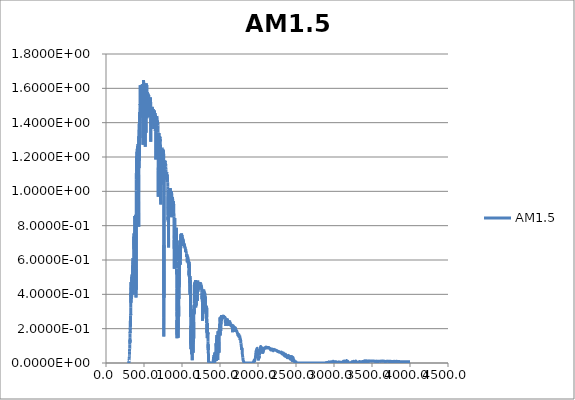
| Category | AM1.5 |
|---|---|
| 280.0 | 0 |
| 280.5 | 0 |
| 281.0 | 0 |
| 281.5 | 0 |
| 282.0 | 0 |
| 282.5 | 0 |
| 283.0 | 0 |
| 283.5 | 0 |
| 284.0 | 0 |
| 284.5 | 0 |
| 285.0 | 0 |
| 285.5 | 0 |
| 286.0 | 0 |
| 286.5 | 0 |
| 287.0 | 0 |
| 287.5 | 0 |
| 288.0 | 0 |
| 288.5 | 0 |
| 289.0 | 0 |
| 289.5 | 0 |
| 290.0 | 0 |
| 290.5 | 0 |
| 291.0 | 0 |
| 291.5 | 0 |
| 292.0 | 0 |
| 292.5 | 0 |
| 293.0 | 0 |
| 293.5 | 0 |
| 294.0 | 0 |
| 294.5 | 0 |
| 295.0 | 0 |
| 295.5 | 0 |
| 296.0 | 0 |
| 296.5 | 0 |
| 297.0 | 0 |
| 297.5 | 0 |
| 298.0 | 0 |
| 298.5 | 0 |
| 299.0 | 0 |
| 299.5 | 0.001 |
| 300.0 | 0.001 |
| 300.5 | 0.001 |
| 301.0 | 0.002 |
| 301.5 | 0.003 |
| 302.0 | 0.003 |
| 302.5 | 0.004 |
| 303.0 | 0.007 |
| 303.5 | 0.009 |
| 304.0 | 0.009 |
| 304.5 | 0.012 |
| 305.0 | 0.016 |
| 305.5 | 0.019 |
| 306.0 | 0.019 |
| 306.5 | 0.021 |
| 307.0 | 0.028 |
| 307.5 | 0.036 |
| 308.0 | 0.038 |
| 308.5 | 0.041 |
| 309.0 | 0.041 |
| 309.5 | 0.043 |
| 310.0 | 0.051 |
| 310.5 | 0.066 |
| 311.0 | 0.083 |
| 311.5 | 0.084 |
| 312.0 | 0.093 |
| 312.5 | 0.099 |
| 313.0 | 0.107 |
| 313.5 | 0.108 |
| 314.0 | 0.12 |
| 314.5 | 0.131 |
| 315.0 | 0.136 |
| 315.5 | 0.118 |
| 316.0 | 0.123 |
| 316.5 | 0.15 |
| 317.0 | 0.172 |
| 317.5 | 0.182 |
| 318.0 | 0.176 |
| 318.5 | 0.186 |
| 319.0 | 0.205 |
| 319.5 | 0.196 |
| 320.0 | 0.205 |
| 320.5 | 0.245 |
| 321.0 | 0.25 |
| 321.5 | 0.238 |
| 322.0 | 0.222 |
| 322.5 | 0.217 |
| 323.0 | 0.212 |
| 323.5 | 0.249 |
| 324.0 | 0.275 |
| 324.5 | 0.283 |
| 325.0 | 0.279 |
| 325.5 | 0.324 |
| 326.0 | 0.381 |
| 326.5 | 0.407 |
| 327.0 | 0.398 |
| 327.5 | 0.385 |
| 328.0 | 0.351 |
| 328.5 | 0.372 |
| 329.0 | 0.422 |
| 329.5 | 0.469 |
| 330.0 | 0.471 |
| 330.5 | 0.428 |
| 331.0 | 0.403 |
| 331.5 | 0.418 |
| 332.0 | 0.436 |
| 332.5 | 0.439 |
| 333.0 | 0.429 |
| 333.5 | 0.407 |
| 334.0 | 0.415 |
| 334.5 | 0.445 |
| 335.0 | 0.464 |
| 335.5 | 0.453 |
| 336.0 | 0.415 |
| 336.5 | 0.382 |
| 337.0 | 0.374 |
| 337.5 | 0.401 |
| 338.0 | 0.434 |
| 338.5 | 0.455 |
| 339.0 | 0.464 |
| 339.5 | 0.474 |
| 340.0 | 0.502 |
| 340.5 | 0.501 |
| 341.0 | 0.471 |
| 341.5 | 0.469 |
| 342.0 | 0.489 |
| 342.5 | 0.508 |
| 343.0 | 0.515 |
| 343.5 | 0.486 |
| 344.0 | 0.418 |
| 344.5 | 0.403 |
| 345.0 | 0.459 |
| 345.5 | 0.489 |
| 346.0 | 0.478 |
| 346.5 | 0.487 |
| 347.0 | 0.494 |
| 347.5 | 0.477 |
| 348.0 | 0.475 |
| 348.5 | 0.483 |
| 349.0 | 0.466 |
| 349.5 | 0.478 |
| 350.0 | 0.528 |
| 350.5 | 0.567 |
| 351.0 | 0.552 |
| 351.5 | 0.53 |
| 352.0 | 0.518 |
| 352.5 | 0.49 |
| 353.0 | 0.52 |
| 353.5 | 0.572 |
| 354.0 | 0.605 |
| 354.5 | 0.612 |
| 355.0 | 0.611 |
| 355.5 | 0.59 |
| 356.0 | 0.554 |
| 356.5 | 0.519 |
| 357.0 | 0.457 |
| 357.5 | 0.462 |
| 358.0 | 0.43 |
| 358.5 | 0.399 |
| 359.0 | 0.47 |
| 359.5 | 0.565 |
| 360.0 | 0.598 |
| 360.5 | 0.565 |
| 361.0 | 0.52 |
| 361.5 | 0.51 |
| 362.0 | 0.534 |
| 362.5 | 0.585 |
| 363.0 | 0.602 |
| 363.5 | 0.585 |
| 364.0 | 0.606 |
| 364.5 | 0.601 |
| 365.0 | 0.624 |
| 365.5 | 0.686 |
| 366.0 | 0.735 |
| 366.5 | 0.737 |
| 367.0 | 0.723 |
| 367.5 | 0.709 |
| 368.0 | 0.668 |
| 368.5 | 0.663 |
| 369.0 | 0.693 |
| 369.5 | 0.745 |
| 370.0 | 0.755 |
| 370.5 | 0.683 |
| 371.0 | 0.693 |
| 371.5 | 0.721 |
| 372.0 | 0.674 |
| 372.5 | 0.643 |
| 373.0 | 0.619 |
| 373.5 | 0.558 |
| 374.0 | 0.556 |
| 374.5 | 0.552 |
| 375.0 | 0.589 |
| 375.5 | 0.652 |
| 376.0 | 0.675 |
| 376.5 | 0.664 |
| 377.0 | 0.712 |
| 377.5 | 0.795 |
| 378.0 | 0.856 |
| 378.5 | 0.834 |
| 379.0 | 0.744 |
| 379.5 | 0.667 |
| 380.0 | 0.701 |
| 380.5 | 0.751 |
| 381.0 | 0.764 |
| 381.5 | 0.688 |
| 382.0 | 0.587 |
| 382.5 | 0.508 |
| 383.0 | 0.455 |
| 383.5 | 0.44 |
| 384.0 | 0.51 |
| 384.5 | 0.614 |
| 385.0 | 0.674 |
| 385.5 | 0.644 |
| 386.0 | 0.621 |
| 386.5 | 0.646 |
| 387.0 | 0.651 |
| 387.5 | 0.642 |
| 388.0 | 0.636 |
| 388.5 | 0.631 |
| 389.0 | 0.685 |
| 389.5 | 0.76 |
| 390.0 | 0.797 |
| 390.5 | 0.804 |
| 391.0 | 0.851 |
| 391.5 | 0.863 |
| 392.0 | 0.795 |
| 392.5 | 0.663 |
| 393.0 | 0.48 |
| 393.5 | 0.382 |
| 394.0 | 0.496 |
| 394.5 | 0.684 |
| 395.0 | 0.808 |
| 395.5 | 0.86 |
| 396.0 | 0.757 |
| 396.5 | 0.55 |
| 397.0 | 0.426 |
| 397.5 | 0.629 |
| 398.0 | 0.852 |
| 398.5 | 1.007 |
| 399.0 | 1.069 |
| 399.5 | 1.102 |
| 400.0 | 1.114 |
| 401.0 | 1.16 |
| 402.0 | 1.206 |
| 403.0 | 1.161 |
| 404.0 | 1.18 |
| 405.0 | 1.151 |
| 406.0 | 1.123 |
| 407.0 | 1.103 |
| 408.0 | 1.151 |
| 409.0 | 1.23 |
| 410.0 | 1.048 |
| 411.0 | 1.174 |
| 412.0 | 1.248 |
| 413.0 | 1.197 |
| 414.0 | 1.184 |
| 415.0 | 1.226 |
| 416.0 | 1.262 |
| 417.0 | 1.231 |
| 418.0 | 1.178 |
| 419.0 | 1.226 |
| 420.0 | 1.123 |
| 421.0 | 1.276 |
| 422.0 | 1.258 |
| 423.0 | 1.218 |
| 424.0 | 1.212 |
| 425.0 | 1.249 |
| 426.0 | 1.214 |
| 427.0 | 1.172 |
| 428.0 | 1.184 |
| 429.0 | 1.096 |
| 430.0 | 0.875 |
| 431.0 | 0.794 |
| 432.0 | 1.321 |
| 433.0 | 1.229 |
| 434.0 | 1.135 |
| 435.0 | 1.245 |
| 436.0 | 1.366 |
| 437.0 | 1.394 |
| 438.0 | 1.224 |
| 439.0 | 1.178 |
| 440.0 | 1.35 |
| 441.0 | 1.331 |
| 442.0 | 1.425 |
| 443.0 | 1.445 |
| 444.0 | 1.408 |
| 445.0 | 1.462 |
| 446.0 | 1.311 |
| 447.0 | 1.49 |
| 448.0 | 1.508 |
| 449.0 | 1.504 |
| 450.0 | 1.56 |
| 451.0 | 1.617 |
| 452.0 | 1.548 |
| 453.0 | 1.43 |
| 454.0 | 1.534 |
| 455.0 | 1.522 |
| 456.0 | 1.572 |
| 457.0 | 1.585 |
| 458.0 | 1.551 |
| 459.0 | 1.539 |
| 460.0 | 1.529 |
| 461.0 | 1.583 |
| 462.0 | 1.598 |
| 463.0 | 1.603 |
| 464.0 | 1.554 |
| 465.0 | 1.535 |
| 466.0 | 1.567 |
| 467.0 | 1.497 |
| 468.0 | 1.562 |
| 469.0 | 1.568 |
| 470.0 | 1.508 |
| 471.0 | 1.533 |
| 472.0 | 1.613 |
| 473.0 | 1.55 |
| 474.0 | 1.567 |
| 475.0 | 1.618 |
| 476.0 | 1.563 |
| 477.0 | 1.572 |
| 478.0 | 1.623 |
| 479.0 | 1.592 |
| 480.0 | 1.618 |
| 481.0 | 1.618 |
| 482.0 | 1.624 |
| 483.0 | 1.604 |
| 484.0 | 1.573 |
| 485.0 | 1.568 |
| 486.0 | 1.272 |
| 487.0 | 1.424 |
| 488.0 | 1.541 |
| 489.0 | 1.452 |
| 490.0 | 1.622 |
| 491.0 | 1.56 |
| 492.0 | 1.487 |
| 493.0 | 1.59 |
| 494.0 | 1.552 |
| 495.0 | 1.648 |
| 496.0 | 1.568 |
| 497.0 | 1.594 |
| 498.0 | 1.551 |
| 499.0 | 1.551 |
| 500.0 | 1.545 |
| 501.0 | 1.498 |
| 502.0 | 1.497 |
| 503.0 | 1.565 |
| 504.0 | 1.459 |
| 505.0 | 1.564 |
| 506.0 | 1.626 |
| 507.0 | 1.556 |
| 508.0 | 1.516 |
| 509.0 | 1.589 |
| 510.0 | 1.548 |
| 511.0 | 1.577 |
| 512.0 | 1.619 |
| 513.0 | 1.521 |
| 514.0 | 1.488 |
| 515.0 | 1.531 |
| 516.0 | 1.546 |
| 517.0 | 1.259 |
| 518.0 | 1.44 |
| 519.0 | 1.396 |
| 520.0 | 1.524 |
| 521.0 | 1.535 |
| 522.0 | 1.569 |
| 523.0 | 1.479 |
| 524.0 | 1.59 |
| 525.0 | 1.578 |
| 526.0 | 1.534 |
| 527.0 | 1.342 |
| 528.0 | 1.536 |
| 529.0 | 1.607 |
| 530.0 | 1.545 |
| 531.0 | 1.629 |
| 532.0 | 1.6 |
| 533.0 | 1.429 |
| 534.0 | 1.53 |
| 535.0 | 1.554 |
| 536.0 | 1.62 |
| 537.0 | 1.499 |
| 538.0 | 1.574 |
| 539.0 | 1.535 |
| 540.0 | 1.482 |
| 541.0 | 1.425 |
| 542.0 | 1.551 |
| 543.0 | 1.526 |
| 544.0 | 1.579 |
| 545.0 | 1.544 |
| 546.0 | 1.529 |
| 547.0 | 1.549 |
| 548.0 | 1.505 |
| 549.0 | 1.552 |
| 550.0 | 1.54 |
| 551.0 | 1.538 |
| 552.0 | 1.57 |
| 553.0 | 1.525 |
| 554.0 | 1.555 |
| 555.0 | 1.563 |
| 556.0 | 1.537 |
| 557.0 | 1.499 |
| 558.0 | 1.531 |
| 559.0 | 1.448 |
| 560.0 | 1.474 |
| 561.0 | 1.56 |
| 562.0 | 1.485 |
| 563.0 | 1.541 |
| 564.0 | 1.511 |
| 565.0 | 1.52 |
| 566.0 | 1.437 |
| 567.0 | 1.532 |
| 568.0 | 1.518 |
| 569.0 | 1.481 |
| 570.0 | 1.482 |
| 571.0 | 1.433 |
| 572.0 | 1.513 |
| 573.0 | 1.52 |
| 574.0 | 1.512 |
| 575.0 | 1.478 |
| 576.0 | 1.465 |
| 577.0 | 1.502 |
| 578.0 | 1.456 |
| 579.0 | 1.477 |
| 580.0 | 1.502 |
| 581.0 | 1.509 |
| 582.0 | 1.532 |
| 583.0 | 1.548 |
| 584.0 | 1.545 |
| 585.0 | 1.532 |
| 586.0 | 1.495 |
| 587.0 | 1.528 |
| 588.0 | 1.493 |
| 589.0 | 1.289 |
| 590.0 | 1.371 |
| 591.0 | 1.466 |
| 592.0 | 1.435 |
| 593.0 | 1.456 |
| 594.0 | 1.449 |
| 595.0 | 1.431 |
| 596.0 | 1.474 |
| 597.0 | 1.479 |
| 598.0 | 1.461 |
| 599.0 | 1.461 |
| 600.0 | 1.475 |
| 601.0 | 1.458 |
| 602.0 | 1.436 |
| 603.0 | 1.466 |
| 604.0 | 1.492 |
| 605.0 | 1.49 |
| 606.0 | 1.482 |
| 607.0 | 1.491 |
| 608.0 | 1.486 |
| 609.0 | 1.475 |
| 610.0 | 1.469 |
| 611.0 | 1.461 |
| 612.0 | 1.483 |
| 613.0 | 1.462 |
| 614.0 | 1.418 |
| 615.0 | 1.47 |
| 616.0 | 1.431 |
| 617.0 | 1.413 |
| 618.0 | 1.466 |
| 619.0 | 1.473 |
| 620.0 | 1.474 |
| 621.0 | 1.48 |
| 622.0 | 1.427 |
| 623.0 | 1.416 |
| 624.0 | 1.412 |
| 625.0 | 1.403 |
| 626.0 | 1.401 |
| 627.0 | 1.442 |
| 628.0 | 1.363 |
| 629.0 | 1.411 |
| 630.0 | 1.392 |
| 631.0 | 1.416 |
| 632.0 | 1.364 |
| 633.0 | 1.451 |
| 634.0 | 1.428 |
| 635.0 | 1.446 |
| 636.0 | 1.413 |
| 637.0 | 1.461 |
| 638.0 | 1.471 |
| 639.0 | 1.465 |
| 640.0 | 1.434 |
| 641.0 | 1.435 |
| 642.0 | 1.438 |
| 643.0 | 1.452 |
| 644.0 | 1.446 |
| 645.0 | 1.457 |
| 646.0 | 1.415 |
| 647.0 | 1.409 |
| 648.0 | 1.395 |
| 649.0 | 1.352 |
| 650.0 | 1.359 |
| 651.0 | 1.445 |
| 652.0 | 1.387 |
| 653.0 | 1.431 |
| 654.0 | 1.415 |
| 655.0 | 1.35 |
| 656.0 | 1.185 |
| 657.0 | 1.239 |
| 658.0 | 1.386 |
| 659.0 | 1.39 |
| 660.0 | 1.399 |
| 661.0 | 1.393 |
| 662.0 | 1.382 |
| 663.0 | 1.384 |
| 664.0 | 1.397 |
| 665.0 | 1.421 |
| 666.0 | 1.42 |
| 667.0 | 1.41 |
| 668.0 | 1.415 |
| 669.0 | 1.439 |
| 670.0 | 1.42 |
| 671.0 | 1.417 |
| 672.0 | 1.397 |
| 673.0 | 1.409 |
| 674.0 | 1.407 |
| 675.0 | 1.396 |
| 676.0 | 1.412 |
| 677.0 | 1.399 |
| 678.0 | 1.407 |
| 679.0 | 1.395 |
| 680.0 | 1.397 |
| 681.0 | 1.392 |
| 682.0 | 1.398 |
| 683.0 | 1.383 |
| 684.0 | 1.374 |
| 685.0 | 1.375 |
| 686.0 | 1.344 |
| 687.0 | 0.968 |
| 688.0 | 1.121 |
| 689.0 | 1.128 |
| 690.0 | 1.182 |
| 691.0 | 1.233 |
| 692.0 | 1.269 |
| 693.0 | 1.261 |
| 694.0 | 1.246 |
| 695.0 | 1.271 |
| 696.0 | 1.268 |
| 697.0 | 1.34 |
| 698.0 | 1.319 |
| 699.0 | 1.292 |
| 700.0 | 1.282 |
| 701.0 | 1.266 |
| 702.0 | 1.267 |
| 703.0 | 1.275 |
| 704.0 | 1.308 |
| 705.0 | 1.321 |
| 706.0 | 1.314 |
| 707.0 | 1.309 |
| 708.0 | 1.305 |
| 709.0 | 1.31 |
| 710.0 | 1.318 |
| 711.0 | 1.316 |
| 712.0 | 1.307 |
| 713.0 | 1.292 |
| 714.0 | 1.303 |
| 715.0 | 1.259 |
| 716.0 | 1.272 |
| 717.0 | 1.107 |
| 718.0 | 1.03 |
| 719.0 | 0.923 |
| 720.0 | 0.986 |
| 721.0 | 1.086 |
| 722.0 | 1.241 |
| 723.0 | 1.144 |
| 724.0 | 1.056 |
| 725.0 | 1.038 |
| 726.0 | 1.081 |
| 727.0 | 1.085 |
| 728.0 | 1.04 |
| 729.0 | 1.047 |
| 730.0 | 1.128 |
| 731.0 | 1.07 |
| 732.0 | 1.153 |
| 733.0 | 1.196 |
| 734.0 | 1.236 |
| 735.0 | 1.218 |
| 736.0 | 1.206 |
| 737.0 | 1.204 |
| 738.0 | 1.227 |
| 739.0 | 1.19 |
| 740.0 | 1.22 |
| 741.0 | 1.215 |
| 742.0 | 1.215 |
| 743.0 | 1.24 |
| 744.0 | 1.25 |
| 745.0 | 1.25 |
| 746.0 | 1.247 |
| 747.0 | 1.248 |
| 748.0 | 1.24 |
| 749.0 | 1.236 |
| 750.0 | 1.234 |
| 751.0 | 1.229 |
| 752.0 | 1.233 |
| 753.0 | 1.227 |
| 754.0 | 1.242 |
| 755.0 | 1.238 |
| 756.0 | 1.223 |
| 757.0 | 1.222 |
| 758.0 | 1.23 |
| 759.0 | 1.194 |
| 760.0 | 0.266 |
| 761.0 | 0.154 |
| 762.0 | 0.688 |
| 763.0 | 0.38 |
| 764.0 | 0.539 |
| 765.0 | 0.686 |
| 766.0 | 0.815 |
| 767.0 | 0.974 |
| 768.0 | 1.114 |
| 769.0 | 1.128 |
| 770.0 | 1.161 |
| 771.0 | 1.169 |
| 772.0 | 1.178 |
| 773.0 | 1.177 |
| 774.0 | 1.177 |
| 775.0 | 1.177 |
| 776.0 | 1.18 |
| 777.0 | 1.173 |
| 778.0 | 1.171 |
| 779.0 | 1.176 |
| 780.0 | 1.164 |
| 781.0 | 1.161 |
| 782.0 | 1.166 |
| 783.0 | 1.161 |
| 784.0 | 1.154 |
| 785.0 | 1.159 |
| 786.0 | 1.159 |
| 787.0 | 1.145 |
| 788.0 | 1.13 |
| 789.0 | 1.126 |
| 790.0 | 1.091 |
| 791.0 | 1.106 |
| 792.0 | 1.095 |
| 793.0 | 1.088 |
| 794.0 | 1.097 |
| 795.0 | 1.093 |
| 796.0 | 1.074 |
| 797.0 | 1.091 |
| 798.0 | 1.112 |
| 799.0 | 1.09 |
| 800.0 | 1.072 |
| 801.0 | 1.084 |
| 802.0 | 1.086 |
| 803.0 | 1.066 |
| 804.0 | 1.078 |
| 805.0 | 1.054 |
| 806.0 | 1.097 |
| 807.0 | 1.086 |
| 808.0 | 1.082 |
| 809.0 | 1.055 |
| 810.0 | 1.056 |
| 811.0 | 1.053 |
| 812.0 | 1.027 |
| 813.0 | 1.009 |
| 814.0 | 0.904 |
| 815.0 | 0.895 |
| 816.0 | 0.832 |
| 817.0 | 0.852 |
| 818.0 | 0.823 |
| 819.0 | 0.905 |
| 820.0 | 0.862 |
| 821.0 | 0.998 |
| 822.0 | 0.952 |
| 823.0 | 0.673 |
| 824.0 | 0.935 |
| 825.0 | 0.969 |
| 826.0 | 0.934 |
| 827.0 | 0.985 |
| 828.0 | 0.85 |
| 829.0 | 0.929 |
| 830.0 | 0.916 |
| 831.0 | 0.924 |
| 832.0 | 0.894 |
| 833.0 | 0.956 |
| 834.0 | 0.934 |
| 835.0 | 1.003 |
| 836.0 | 0.972 |
| 837.0 | 1.009 |
| 838.0 | 0.999 |
| 839.0 | 1.001 |
| 840.0 | 1.016 |
| 841.0 | 1.01 |
| 842.0 | 0.997 |
| 843.0 | 1.005 |
| 844.0 | 0.986 |
| 845.0 | 1.016 |
| 846.0 | 1.019 |
| 847.0 | 0.992 |
| 848.0 | 0.992 |
| 849.0 | 0.986 |
| 850.0 | 0.894 |
| 851.0 | 0.975 |
| 852.0 | 0.969 |
| 853.0 | 0.965 |
| 854.0 | 0.851 |
| 855.0 | 0.913 |
| 856.0 | 0.973 |
| 857.0 | 0.992 |
| 858.0 | 0.992 |
| 859.0 | 0.992 |
| 860.0 | 0.988 |
| 861.0 | 0.987 |
| 862.0 | 0.994 |
| 863.0 | 1 |
| 864.0 | 0.979 |
| 865.0 | 0.963 |
| 866.0 | 0.849 |
| 867.0 | 0.915 |
| 868.0 | 0.959 |
| 869.0 | 0.95 |
| 870.0 | 0.968 |
| 871.0 | 0.954 |
| 872.0 | 0.967 |
| 873.0 | 0.957 |
| 874.0 | 0.94 |
| 875.0 | 0.927 |
| 876.0 | 0.953 |
| 877.0 | 0.956 |
| 878.0 | 0.952 |
| 879.0 | 0.937 |
| 880.0 | 0.94 |
| 881.0 | 0.909 |
| 882.0 | 0.932 |
| 883.0 | 0.929 |
| 884.0 | 0.933 |
| 885.0 | 0.944 |
| 886.0 | 0.908 |
| 887.0 | 0.911 |
| 888.0 | 0.922 |
| 889.0 | 0.935 |
| 890.0 | 0.924 |
| 891.0 | 0.926 |
| 892.0 | 0.909 |
| 893.0 | 0.873 |
| 894.0 | 0.851 |
| 895.0 | 0.814 |
| 896.0 | 0.763 |
| 897.0 | 0.666 |
| 898.0 | 0.718 |
| 899.0 | 0.549 |
| 900.0 | 0.743 |
| 901.0 | 0.599 |
| 902.0 | 0.668 |
| 903.0 | 0.689 |
| 904.0 | 0.845 |
| 905.0 | 0.817 |
| 906.0 | 0.776 |
| 907.0 | 0.639 |
| 908.0 | 0.652 |
| 909.0 | 0.704 |
| 910.0 | 0.625 |
| 911.0 | 0.668 |
| 912.0 | 0.689 |
| 913.0 | 0.628 |
| 914.0 | 0.626 |
| 915.0 | 0.678 |
| 916.0 | 0.576 |
| 917.0 | 0.73 |
| 918.0 | 0.593 |
| 919.0 | 0.739 |
| 920.0 | 0.744 |
| 921.0 | 0.78 |
| 922.0 | 0.7 |
| 923.0 | 0.745 |
| 924.0 | 0.722 |
| 925.0 | 0.711 |
| 926.0 | 0.703 |
| 927.0 | 0.787 |
| 928.0 | 0.59 |
| 929.0 | 0.551 |
| 930.0 | 0.432 |
| 931.0 | 0.409 |
| 932.0 | 0.301 |
| 933.0 | 0.248 |
| 934.0 | 0.144 |
| 935.0 | 0.251 |
| 936.0 | 0.161 |
| 937.0 | 0.163 |
| 938.0 | 0.201 |
| 939.0 | 0.399 |
| 940.0 | 0.472 |
| 941.0 | 0.372 |
| 942.0 | 0.405 |
| 943.0 | 0.278 |
| 944.0 | 0.286 |
| 945.0 | 0.368 |
| 946.0 | 0.195 |
| 947.0 | 0.371 |
| 948.0 | 0.274 |
| 949.0 | 0.494 |
| 950.0 | 0.147 |
| 951.0 | 0.484 |
| 952.0 | 0.269 |
| 953.0 | 0.344 |
| 954.0 | 0.424 |
| 955.0 | 0.341 |
| 956.0 | 0.328 |
| 957.0 | 0.271 |
| 958.0 | 0.461 |
| 959.0 | 0.374 |
| 960.0 | 0.421 |
| 961.0 | 0.461 |
| 962.0 | 0.442 |
| 963.0 | 0.505 |
| 964.0 | 0.459 |
| 965.0 | 0.504 |
| 966.0 | 0.503 |
| 967.0 | 0.502 |
| 968.0 | 0.652 |
| 969.0 | 0.686 |
| 970.0 | 0.635 |
| 971.0 | 0.714 |
| 972.0 | 0.688 |
| 973.0 | 0.606 |
| 974.0 | 0.575 |
| 975.0 | 0.59 |
| 976.0 | 0.572 |
| 977.0 | 0.639 |
| 978.0 | 0.615 |
| 979.0 | 0.638 |
| 980.0 | 0.605 |
| 981.0 | 0.713 |
| 982.0 | 0.692 |
| 983.0 | 0.669 |
| 984.0 | 0.737 |
| 985.0 | 0.688 |
| 986.0 | 0.751 |
| 987.0 | 0.739 |
| 988.0 | 0.735 |
| 989.0 | 0.749 |
| 990.0 | 0.732 |
| 991.0 | 0.754 |
| 992.0 | 0.751 |
| 993.0 | 0.737 |
| 994.0 | 0.754 |
| 995.0 | 0.752 |
| 996.0 | 0.749 |
| 997.0 | 0.74 |
| 998.0 | 0.739 |
| 999.0 | 0.739 |
| 1000.0 | 0.735 |
| 1001.0 | 0.744 |
| 1002.0 | 0.728 |
| 1003.0 | 0.734 |
| 1004.0 | 0.723 |
| 1005.0 | 0.682 |
| 1006.0 | 0.713 |
| 1007.0 | 0.728 |
| 1008.0 | 0.727 |
| 1009.0 | 0.72 |
| 1010.0 | 0.719 |
| 1011.0 | 0.723 |
| 1012.0 | 0.719 |
| 1013.0 | 0.718 |
| 1014.0 | 0.721 |
| 1015.0 | 0.708 |
| 1016.0 | 0.711 |
| 1017.0 | 0.703 |
| 1018.0 | 0.714 |
| 1019.0 | 0.689 |
| 1020.0 | 0.699 |
| 1021.0 | 0.702 |
| 1022.0 | 0.69 |
| 1023.0 | 0.695 |
| 1024.0 | 0.691 |
| 1025.0 | 0.698 |
| 1026.0 | 0.696 |
| 1027.0 | 0.693 |
| 1028.0 | 0.694 |
| 1029.0 | 0.686 |
| 1030.0 | 0.691 |
| 1031.0 | 0.687 |
| 1032.0 | 0.688 |
| 1033.0 | 0.676 |
| 1034.0 | 0.68 |
| 1035.0 | 0.682 |
| 1036.0 | 0.682 |
| 1037.0 | 0.675 |
| 1038.0 | 0.672 |
| 1039.0 | 0.676 |
| 1040.0 | 0.672 |
| 1041.0 | 0.672 |
| 1042.0 | 0.672 |
| 1043.0 | 0.665 |
| 1044.0 | 0.668 |
| 1045.0 | 0.665 |
| 1046.0 | 0.647 |
| 1047.0 | 0.657 |
| 1048.0 | 0.663 |
| 1049.0 | 0.659 |
| 1050.0 | 0.655 |
| 1051.0 | 0.655 |
| 1052.0 | 0.651 |
| 1053.0 | 0.649 |
| 1054.0 | 0.646 |
| 1055.0 | 0.648 |
| 1056.0 | 0.646 |
| 1057.0 | 0.645 |
| 1058.0 | 0.638 |
| 1059.0 | 0.619 |
| 1060.0 | 0.636 |
| 1061.0 | 0.621 |
| 1062.0 | 0.633 |
| 1063.0 | 0.622 |
| 1064.0 | 0.632 |
| 1065.0 | 0.629 |
| 1066.0 | 0.617 |
| 1067.0 | 0.62 |
| 1068.0 | 0.619 |
| 1069.0 | 0.586 |
| 1070.0 | 0.605 |
| 1071.0 | 0.617 |
| 1072.0 | 0.615 |
| 1073.0 | 0.604 |
| 1074.0 | 0.622 |
| 1075.0 | 0.593 |
| 1076.0 | 0.615 |
| 1077.0 | 0.604 |
| 1078.0 | 0.603 |
| 1079.0 | 0.605 |
| 1080.0 | 0.597 |
| 1081.0 | 0.581 |
| 1082.0 | 0.589 |
| 1083.0 | 0.598 |
| 1084.0 | 0.579 |
| 1085.0 | 0.593 |
| 1086.0 | 0.554 |
| 1087.0 | 0.567 |
| 1088.0 | 0.593 |
| 1089.0 | 0.579 |
| 1090.0 | 0.556 |
| 1091.0 | 0.588 |
| 1092.0 | 0.581 |
| 1093.0 | 0.511 |
| 1094.0 | 0.54 |
| 1095.0 | 0.521 |
| 1096.0 | 0.503 |
| 1097.0 | 0.579 |
| 1098.0 | 0.503 |
| 1099.0 | 0.508 |
| 1100.0 | 0.486 |
| 1101.0 | 0.497 |
| 1102.0 | 0.469 |
| 1103.0 | 0.466 |
| 1104.0 | 0.468 |
| 1105.0 | 0.506 |
| 1106.0 | 0.398 |
| 1107.0 | 0.483 |
| 1108.0 | 0.416 |
| 1109.0 | 0.413 |
| 1110.0 | 0.479 |
| 1111.0 | 0.332 |
| 1112.0 | 0.414 |
| 1113.0 | 0.268 |
| 1114.0 | 0.3 |
| 1115.0 | 0.25 |
| 1116.0 | 0.201 |
| 1117.0 | 0.08 |
| 1118.0 | 0.218 |
| 1119.0 | 0.113 |
| 1120.0 | 0.142 |
| 1121.0 | 0.186 |
| 1122.0 | 0.082 |
| 1123.0 | 0.128 |
| 1124.0 | 0.109 |
| 1125.0 | 0.144 |
| 1126.0 | 0.052 |
| 1127.0 | 0.157 |
| 1128.0 | 0.099 |
| 1129.0 | 0.106 |
| 1130.0 | 0.071 |
| 1131.0 | 0.296 |
| 1132.0 | 0.234 |
| 1133.0 | 0.153 |
| 1134.0 | 0.042 |
| 1135.0 | 0.015 |
| 1136.0 | 0.129 |
| 1137.0 | 0.288 |
| 1138.0 | 0.203 |
| 1139.0 | 0.298 |
| 1140.0 | 0.256 |
| 1141.0 | 0.193 |
| 1142.0 | 0.225 |
| 1143.0 | 0.312 |
| 1144.0 | 0.113 |
| 1145.0 | 0.146 |
| 1146.0 | 0.158 |
| 1147.0 | 0.059 |
| 1148.0 | 0.271 |
| 1149.0 | 0.219 |
| 1150.0 | 0.122 |
| 1151.0 | 0.203 |
| 1152.0 | 0.248 |
| 1153.0 | 0.238 |
| 1154.0 | 0.142 |
| 1155.0 | 0.313 |
| 1156.0 | 0.281 |
| 1157.0 | 0.315 |
| 1158.0 | 0.312 |
| 1159.0 | 0.337 |
| 1160.0 | 0.286 |
| 1161.0 | 0.348 |
| 1162.0 | 0.35 |
| 1163.0 | 0.469 |
| 1164.0 | 0.402 |
| 1165.0 | 0.389 |
| 1166.0 | 0.375 |
| 1167.0 | 0.41 |
| 1168.0 | 0.42 |
| 1169.0 | 0.423 |
| 1170.0 | 0.459 |
| 1171.0 | 0.448 |
| 1172.0 | 0.455 |
| 1173.0 | 0.456 |
| 1174.0 | 0.337 |
| 1175.0 | 0.452 |
| 1176.0 | 0.477 |
| 1177.0 | 0.472 |
| 1178.0 | 0.36 |
| 1179.0 | 0.484 |
| 1180.0 | 0.441 |
| 1181.0 | 0.455 |
| 1182.0 | 0.323 |
| 1183.0 | 0.439 |
| 1184.0 | 0.42 |
| 1185.0 | 0.407 |
| 1186.0 | 0.477 |
| 1187.0 | 0.456 |
| 1188.0 | 0.335 |
| 1189.0 | 0.416 |
| 1190.0 | 0.462 |
| 1191.0 | 0.447 |
| 1192.0 | 0.473 |
| 1193.0 | 0.454 |
| 1194.0 | 0.469 |
| 1195.0 | 0.447 |
| 1196.0 | 0.431 |
| 1197.0 | 0.477 |
| 1198.0 | 0.434 |
| 1199.0 | 0.365 |
| 1200.0 | 0.448 |
| 1201.0 | 0.437 |
| 1202.0 | 0.437 |
| 1203.0 | 0.434 |
| 1204.0 | 0.362 |
| 1205.0 | 0.437 |
| 1206.0 | 0.481 |
| 1207.0 | 0.43 |
| 1208.0 | 0.433 |
| 1209.0 | 0.414 |
| 1210.0 | 0.453 |
| 1211.0 | 0.422 |
| 1212.0 | 0.425 |
| 1213.0 | 0.47 |
| 1214.0 | 0.434 |
| 1215.0 | 0.428 |
| 1216.0 | 0.466 |
| 1217.0 | 0.455 |
| 1218.0 | 0.459 |
| 1219.0 | 0.447 |
| 1220.0 | 0.458 |
| 1221.0 | 0.465 |
| 1222.0 | 0.451 |
| 1223.0 | 0.444 |
| 1224.0 | 0.448 |
| 1225.0 | 0.462 |
| 1226.0 | 0.468 |
| 1227.0 | 0.433 |
| 1228.0 | 0.467 |
| 1229.0 | 0.467 |
| 1230.0 | 0.46 |
| 1231.0 | 0.472 |
| 1232.0 | 0.466 |
| 1233.0 | 0.454 |
| 1234.0 | 0.47 |
| 1235.0 | 0.465 |
| 1236.0 | 0.469 |
| 1237.0 | 0.463 |
| 1238.0 | 0.468 |
| 1239.0 | 0.463 |
| 1240.0 | 0.461 |
| 1241.0 | 0.462 |
| 1242.0 | 0.462 |
| 1243.0 | 0.458 |
| 1244.0 | 0.455 |
| 1245.0 | 0.457 |
| 1246.0 | 0.459 |
| 1247.0 | 0.457 |
| 1248.0 | 0.459 |
| 1249.0 | 0.46 |
| 1250.0 | 0.457 |
| 1251.0 | 0.453 |
| 1252.0 | 0.451 |
| 1253.0 | 0.448 |
| 1254.0 | 0.444 |
| 1255.0 | 0.451 |
| 1256.0 | 0.44 |
| 1257.0 | 0.435 |
| 1258.0 | 0.445 |
| 1259.0 | 0.427 |
| 1260.0 | 0.431 |
| 1261.0 | 0.411 |
| 1262.0 | 0.396 |
| 1263.0 | 0.4 |
| 1264.0 | 0.371 |
| 1265.0 | 0.396 |
| 1266.0 | 0.385 |
| 1267.0 | 0.388 |
| 1268.0 | 0.371 |
| 1269.0 | 0.247 |
| 1270.0 | 0.387 |
| 1271.0 | 0.408 |
| 1272.0 | 0.409 |
| 1273.0 | 0.406 |
| 1274.0 | 0.406 |
| 1275.0 | 0.412 |
| 1276.0 | 0.417 |
| 1277.0 | 0.42 |
| 1278.0 | 0.428 |
| 1279.0 | 0.425 |
| 1280.0 | 0.422 |
| 1281.0 | 0.413 |
| 1282.0 | 0.373 |
| 1283.0 | 0.407 |
| 1284.0 | 0.421 |
| 1285.0 | 0.424 |
| 1286.0 | 0.427 |
| 1287.0 | 0.422 |
| 1288.0 | 0.42 |
| 1289.0 | 0.409 |
| 1290.0 | 0.413 |
| 1291.0 | 0.418 |
| 1292.0 | 0.396 |
| 1293.0 | 0.413 |
| 1294.0 | 0.404 |
| 1295.0 | 0.405 |
| 1296.0 | 0.39 |
| 1297.0 | 0.371 |
| 1298.0 | 0.392 |
| 1299.0 | 0.409 |
| 1300.0 | 0.353 |
| 1301.0 | 0.362 |
| 1302.0 | 0.392 |
| 1303.0 | 0.346 |
| 1304.0 | 0.301 |
| 1305.0 | 0.384 |
| 1306.0 | 0.385 |
| 1307.0 | 0.306 |
| 1308.0 | 0.347 |
| 1309.0 | 0.384 |
| 1310.0 | 0.301 |
| 1311.0 | 0.334 |
| 1312.0 | 0.333 |
| 1313.0 | 0.314 |
| 1314.0 | 0.288 |
| 1315.0 | 0.286 |
| 1316.0 | 0.324 |
| 1317.0 | 0.312 |
| 1318.0 | 0.333 |
| 1319.0 | 0.269 |
| 1320.0 | 0.259 |
| 1321.0 | 0.299 |
| 1322.0 | 0.302 |
| 1323.0 | 0.233 |
| 1324.0 | 0.262 |
| 1325.0 | 0.322 |
| 1326.0 | 0.281 |
| 1327.0 | 0.266 |
| 1328.0 | 0.234 |
| 1329.0 | 0.178 |
| 1330.0 | 0.229 |
| 1331.0 | 0.145 |
| 1332.0 | 0.146 |
| 1333.0 | 0.203 |
| 1334.0 | 0.169 |
| 1335.0 | 0.231 |
| 1336.0 | 0.183 |
| 1337.0 | 0.165 |
| 1338.0 | 0.178 |
| 1339.0 | 0.177 |
| 1340.0 | 0.168 |
| 1341.0 | 0.17 |
| 1342.0 | 0.178 |
| 1343.0 | 0.127 |
| 1344.0 | 0.076 |
| 1345.0 | 0.109 |
| 1346.0 | 0.058 |
| 1347.0 | 0.06 |
| 1348.0 | 0.005 |
| 1349.0 | 0.016 |
| 1350.0 | 0.016 |
| 1351.0 | 0.005 |
| 1352.0 | 0.002 |
| 1353.0 | 0 |
| 1354.0 | 0 |
| 1355.0 | 0 |
| 1356.0 | 0 |
| 1357.0 | 0 |
| 1358.0 | 0 |
| 1359.0 | 0 |
| 1360.0 | 0 |
| 1361.0 | 0 |
| 1362.0 | 0 |
| 1363.0 | 0 |
| 1364.0 | 0 |
| 1365.0 | 0 |
| 1366.0 | 0 |
| 1367.0 | 0 |
| 1368.0 | 0 |
| 1369.0 | 0 |
| 1370.0 | 0 |
| 1371.0 | 0 |
| 1372.0 | 0 |
| 1373.0 | 0 |
| 1374.0 | 0 |
| 1375.0 | 0 |
| 1376.0 | 0 |
| 1377.0 | 0 |
| 1378.0 | 0.001 |
| 1379.0 | 0 |
| 1380.0 | 0 |
| 1381.0 | 0 |
| 1382.0 | 0 |
| 1383.0 | 0 |
| 1384.0 | 0 |
| 1385.0 | 0 |
| 1386.0 | 0 |
| 1387.0 | 0 |
| 1388.0 | 0 |
| 1389.0 | 0.001 |
| 1390.0 | 0 |
| 1391.0 | 0 |
| 1392.0 | 0 |
| 1393.0 | 0 |
| 1394.0 | 0 |
| 1395.0 | 0 |
| 1396.0 | 0 |
| 1397.0 | 0 |
| 1398.0 | 0.001 |
| 1399.0 | 0.001 |
| 1400.0 | 0 |
| 1401.0 | 0 |
| 1402.0 | 0.002 |
| 1403.0 | 0.002 |
| 1404.0 | 0.001 |
| 1405.0 | 0 |
| 1406.0 | 0.002 |
| 1407.0 | 0 |
| 1408.0 | 0.002 |
| 1409.0 | 0.001 |
| 1410.0 | 0 |
| 1411.0 | 0.002 |
| 1412.0 | 0.003 |
| 1413.0 | 0.023 |
| 1414.0 | 0 |
| 1415.0 | 0 |
| 1416.0 | 0.036 |
| 1417.0 | 0.012 |
| 1418.0 | 0.014 |
| 1419.0 | 0.002 |
| 1420.0 | 0.008 |
| 1421.0 | 0.009 |
| 1422.0 | 0.046 |
| 1423.0 | 0.009 |
| 1424.0 | 0.017 |
| 1425.0 | 0.026 |
| 1426.0 | 0.028 |
| 1427.0 | 0.05 |
| 1428.0 | 0.005 |
| 1429.0 | 0.038 |
| 1430.0 | 0.062 |
| 1431.0 | 0.05 |
| 1432.0 | 0.003 |
| 1433.0 | 0.036 |
| 1434.0 | 0.021 |
| 1435.0 | 0.021 |
| 1436.0 | 0.038 |
| 1437.0 | 0.03 |
| 1438.0 | 0.013 |
| 1439.0 | 0.051 |
| 1440.0 | 0.04 |
| 1441.0 | 0.032 |
| 1442.0 | 0.036 |
| 1443.0 | 0.045 |
| 1444.0 | 0.062 |
| 1445.0 | 0.05 |
| 1446.0 | 0.023 |
| 1447.0 | 0.036 |
| 1448.0 | 0.116 |
| 1449.0 | 0.102 |
| 1450.0 | 0.027 |
| 1451.0 | 0.011 |
| 1452.0 | 0.062 |
| 1453.0 | 0.082 |
| 1454.0 | 0.138 |
| 1455.0 | 0.066 |
| 1456.0 | 0.089 |
| 1457.0 | 0.117 |
| 1458.0 | 0.136 |
| 1459.0 | 0.163 |
| 1460.0 | 0.085 |
| 1461.0 | 0.09 |
| 1462.0 | 0.131 |
| 1463.0 | 0.043 |
| 1464.0 | 0.152 |
| 1465.0 | 0.093 |
| 1466.0 | 0.065 |
| 1467.0 | 0.036 |
| 1468.0 | 0.077 |
| 1469.0 | 0.095 |
| 1470.0 | 0.05 |
| 1471.0 | 0.018 |
| 1472.0 | 0.047 |
| 1473.0 | 0.07 |
| 1474.0 | 0.097 |
| 1475.0 | 0.185 |
| 1476.0 | 0.069 |
| 1477.0 | 0.07 |
| 1478.0 | 0.063 |
| 1479.0 | 0.12 |
| 1480.0 | 0.061 |
| 1481.0 | 0.115 |
| 1482.0 | 0.058 |
| 1483.0 | 0.149 |
| 1484.0 | 0.137 |
| 1485.0 | 0.125 |
| 1486.0 | 0.123 |
| 1487.0 | 0.061 |
| 1488.0 | 0.094 |
| 1489.0 | 0.19 |
| 1490.0 | 0.175 |
| 1491.0 | 0.198 |
| 1492.0 | 0.164 |
| 1493.0 | 0.182 |
| 1494.0 | 0.204 |
| 1495.0 | 0.183 |
| 1496.0 | 0.169 |
| 1497.0 | 0.228 |
| 1498.0 | 0.19 |
| 1499.0 | 0.218 |
| 1500.0 | 0.251 |
| 1501.0 | 0.266 |
| 1502.0 | 0.234 |
| 1503.0 | 0.185 |
| 1504.0 | 0.16 |
| 1505.0 | 0.184 |
| 1506.0 | 0.258 |
| 1507.0 | 0.255 |
| 1508.0 | 0.243 |
| 1509.0 | 0.187 |
| 1510.0 | 0.271 |
| 1511.0 | 0.265 |
| 1512.0 | 0.261 |
| 1513.0 | 0.242 |
| 1514.0 | 0.226 |
| 1515.0 | 0.266 |
| 1516.0 | 0.257 |
| 1517.0 | 0.249 |
| 1518.0 | 0.252 |
| 1519.0 | 0.244 |
| 1520.0 | 0.264 |
| 1521.0 | 0.275 |
| 1522.0 | 0.264 |
| 1523.0 | 0.28 |
| 1524.0 | 0.275 |
| 1525.0 | 0.259 |
| 1526.0 | 0.267 |
| 1527.0 | 0.262 |
| 1528.0 | 0.279 |
| 1529.0 | 0.272 |
| 1530.0 | 0.255 |
| 1531.0 | 0.27 |
| 1532.0 | 0.278 |
| 1533.0 | 0.277 |
| 1534.0 | 0.269 |
| 1535.0 | 0.267 |
| 1536.0 | 0.275 |
| 1537.0 | 0.273 |
| 1538.0 | 0.272 |
| 1539.0 | 0.273 |
| 1540.0 | 0.265 |
| 1541.0 | 0.269 |
| 1542.0 | 0.269 |
| 1543.0 | 0.272 |
| 1544.0 | 0.272 |
| 1545.0 | 0.277 |
| 1546.0 | 0.275 |
| 1547.0 | 0.273 |
| 1548.0 | 0.267 |
| 1549.0 | 0.273 |
| 1550.0 | 0.27 |
| 1551.0 | 0.271 |
| 1552.0 | 0.272 |
| 1553.0 | 0.271 |
| 1554.0 | 0.265 |
| 1555.0 | 0.268 |
| 1556.0 | 0.263 |
| 1557.0 | 0.271 |
| 1558.0 | 0.268 |
| 1559.0 | 0.268 |
| 1560.0 | 0.266 |
| 1561.0 | 0.27 |
| 1562.0 | 0.268 |
| 1563.0 | 0.267 |
| 1564.0 | 0.263 |
| 1565.0 | 0.267 |
| 1566.0 | 0.262 |
| 1567.0 | 0.263 |
| 1568.0 | 0.257 |
| 1569.0 | 0.255 |
| 1570.0 | 0.242 |
| 1571.0 | 0.235 |
| 1572.0 | 0.238 |
| 1573.0 | 0.234 |
| 1574.0 | 0.241 |
| 1575.0 | 0.24 |
| 1576.0 | 0.247 |
| 1577.0 | 0.216 |
| 1578.0 | 0.235 |
| 1579.0 | 0.237 |
| 1580.0 | 0.245 |
| 1581.0 | 0.249 |
| 1582.0 | 0.242 |
| 1583.0 | 0.248 |
| 1584.0 | 0.249 |
| 1585.0 | 0.259 |
| 1586.0 | 0.256 |
| 1587.0 | 0.253 |
| 1588.0 | 0.251 |
| 1589.0 | 0.232 |
| 1590.0 | 0.242 |
| 1591.0 | 0.242 |
| 1592.0 | 0.252 |
| 1593.0 | 0.258 |
| 1594.0 | 0.256 |
| 1595.0 | 0.258 |
| 1596.0 | 0.245 |
| 1597.0 | 0.247 |
| 1598.0 | 0.254 |
| 1599.0 | 0.242 |
| 1600.0 | 0.238 |
| 1601.0 | 0.223 |
| 1602.0 | 0.224 |
| 1603.0 | 0.224 |
| 1604.0 | 0.228 |
| 1605.0 | 0.237 |
| 1606.0 | 0.241 |
| 1607.0 | 0.233 |
| 1608.0 | 0.23 |
| 1609.0 | 0.227 |
| 1610.0 | 0.218 |
| 1611.0 | 0.227 |
| 1612.0 | 0.231 |
| 1613.0 | 0.237 |
| 1614.0 | 0.238 |
| 1615.0 | 0.241 |
| 1616.0 | 0.23 |
| 1617.0 | 0.235 |
| 1618.0 | 0.244 |
| 1619.0 | 0.241 |
| 1620.0 | 0.234 |
| 1621.0 | 0.234 |
| 1622.0 | 0.238 |
| 1623.0 | 0.242 |
| 1624.0 | 0.243 |
| 1625.0 | 0.238 |
| 1626.0 | 0.24 |
| 1627.0 | 0.241 |
| 1628.0 | 0.241 |
| 1629.0 | 0.241 |
| 1630.0 | 0.237 |
| 1631.0 | 0.238 |
| 1632.0 | 0.238 |
| 1633.0 | 0.233 |
| 1634.0 | 0.233 |
| 1635.0 | 0.234 |
| 1636.0 | 0.235 |
| 1637.0 | 0.227 |
| 1638.0 | 0.22 |
| 1639.0 | 0.22 |
| 1640.0 | 0.215 |
| 1641.0 | 0.22 |
| 1642.0 | 0.221 |
| 1643.0 | 0.215 |
| 1644.0 | 0.224 |
| 1645.0 | 0.218 |
| 1646.0 | 0.217 |
| 1647.0 | 0.228 |
| 1648.0 | 0.217 |
| 1649.0 | 0.219 |
| 1650.0 | 0.225 |
| 1651.0 | 0.209 |
| 1652.0 | 0.224 |
| 1653.0 | 0.223 |
| 1654.0 | 0.216 |
| 1655.0 | 0.222 |
| 1656.0 | 0.221 |
| 1657.0 | 0.222 |
| 1658.0 | 0.225 |
| 1659.0 | 0.221 |
| 1660.0 | 0.223 |
| 1661.0 | 0.224 |
| 1662.0 | 0.219 |
| 1663.0 | 0.222 |
| 1664.0 | 0.221 |
| 1665.0 | 0.212 |
| 1666.0 | 0.179 |
| 1667.0 | 0.211 |
| 1668.0 | 0.215 |
| 1669.0 | 0.215 |
| 1670.0 | 0.222 |
| 1671.0 | 0.219 |
| 1672.0 | 0.211 |
| 1673.0 | 0.216 |
| 1674.0 | 0.216 |
| 1675.0 | 0.214 |
| 1676.0 | 0.211 |
| 1677.0 | 0.212 |
| 1678.0 | 0.209 |
| 1679.0 | 0.213 |
| 1680.0 | 0.206 |
| 1681.0 | 0.194 |
| 1682.0 | 0.204 |
| 1683.0 | 0.209 |
| 1684.0 | 0.198 |
| 1685.0 | 0.213 |
| 1686.0 | 0.21 |
| 1687.0 | 0.205 |
| 1688.0 | 0.21 |
| 1689.0 | 0.207 |
| 1690.0 | 0.205 |
| 1691.0 | 0.193 |
| 1692.0 | 0.207 |
| 1693.0 | 0.211 |
| 1694.0 | 0.205 |
| 1695.0 | 0.21 |
| 1696.0 | 0.209 |
| 1697.0 | 0.181 |
| 1698.0 | 0.207 |
| 1699.0 | 0.206 |
| 1700.0 | 0.2 |
| 1702.0 | 0.204 |
| 1705.0 | 0.198 |
| 1710.0 | 0.188 |
| 1715.0 | 0.19 |
| 1720.0 | 0.187 |
| 1725.0 | 0.178 |
| 1730.0 | 0.174 |
| 1735.0 | 0.162 |
| 1740.0 | 0.168 |
| 1745.0 | 0.155 |
| 1750.0 | 0.166 |
| 1755.0 | 0.153 |
| 1760.0 | 0.16 |
| 1765.0 | 0.133 |
| 1770.0 | 0.142 |
| 1775.0 | 0.115 |
| 1780.0 | 0.1 |
| 1785.0 | 0.077 |
| 1790.0 | 0.089 |
| 1795.0 | 0.047 |
| 1800.0 | 0.032 |
| 1805.0 | 0.015 |
| 1810.0 | 0.01 |
| 1815.0 | 0.003 |
| 1820.0 | 0.001 |
| 1825.0 | 0.001 |
| 1830.0 | 0 |
| 1835.0 | 0 |
| 1840.0 | 0 |
| 1845.0 | 0 |
| 1850.0 | 0 |
| 1855.0 | 0 |
| 1860.0 | 0 |
| 1865.0 | 0 |
| 1870.0 | 0 |
| 1875.0 | 0 |
| 1880.0 | 0 |
| 1885.0 | 0 |
| 1890.0 | 0 |
| 1895.0 | 0 |
| 1900.0 | 0 |
| 1905.0 | 0 |
| 1910.0 | 0 |
| 1915.0 | 0 |
| 1920.0 | 0 |
| 1925.0 | 0.001 |
| 1930.0 | 0.001 |
| 1935.0 | 0.004 |
| 1940.0 | 0.003 |
| 1945.0 | 0.011 |
| 1950.0 | 0.017 |
| 1955.0 | 0.01 |
| 1960.0 | 0.022 |
| 1965.0 | 0.029 |
| 1970.0 | 0.049 |
| 1975.0 | 0.068 |
| 1980.0 | 0.076 |
| 1985.0 | 0.083 |
| 1990.0 | 0.086 |
| 1995.0 | 0.081 |
| 2000.0 | 0.038 |
| 2005.0 | 0.015 |
| 2010.0 | 0.04 |
| 2015.0 | 0.027 |
| 2020.0 | 0.045 |
| 2025.0 | 0.074 |
| 2030.0 | 0.085 |
| 2035.0 | 0.096 |
| 2040.0 | 0.09 |
| 2045.0 | 0.091 |
| 2050.0 | 0.068 |
| 2055.0 | 0.055 |
| 2060.0 | 0.069 |
| 2065.0 | 0.062 |
| 2070.0 | 0.066 |
| 2075.0 | 0.077 |
| 2080.0 | 0.087 |
| 2085.0 | 0.085 |
| 2090.0 | 0.089 |
| 2095.0 | 0.09 |
| 2100.0 | 0.086 |
| 2105.0 | 0.093 |
| 2110.0 | 0.09 |
| 2115.0 | 0.092 |
| 2120.0 | 0.088 |
| 2125.0 | 0.089 |
| 2130.0 | 0.09 |
| 2135.0 | 0.09 |
| 2140.0 | 0.091 |
| 2145.0 | 0.089 |
| 2150.0 | 0.085 |
| 2155.0 | 0.085 |
| 2160.0 | 0.084 |
| 2165.0 | 0.076 |
| 2170.0 | 0.082 |
| 2175.0 | 0.08 |
| 2180.0 | 0.082 |
| 2185.0 | 0.075 |
| 2190.0 | 0.079 |
| 2195.0 | 0.079 |
| 2200.0 | 0.071 |
| 2205.0 | 0.074 |
| 2210.0 | 0.079 |
| 2215.0 | 0.076 |
| 2220.0 | 0.078 |
| 2225.0 | 0.075 |
| 2230.0 | 0.076 |
| 2235.0 | 0.074 |
| 2240.0 | 0.073 |
| 2245.0 | 0.071 |
| 2250.0 | 0.072 |
| 2255.0 | 0.068 |
| 2260.0 | 0.067 |
| 2265.0 | 0.068 |
| 2270.0 | 0.065 |
| 2275.0 | 0.064 |
| 2280.0 | 0.066 |
| 2285.0 | 0.063 |
| 2290.0 | 0.063 |
| 2295.0 | 0.061 |
| 2300.0 | 0.059 |
| 2305.0 | 0.059 |
| 2310.0 | 0.064 |
| 2315.0 | 0.058 |
| 2320.0 | 0.052 |
| 2325.0 | 0.056 |
| 2330.0 | 0.057 |
| 2335.0 | 0.058 |
| 2340.0 | 0.046 |
| 2345.0 | 0.051 |
| 2350.0 | 0.042 |
| 2355.0 | 0.047 |
| 2360.0 | 0.05 |
| 2365.0 | 0.049 |
| 2370.0 | 0.031 |
| 2375.0 | 0.044 |
| 2380.0 | 0.043 |
| 2385.0 | 0.031 |
| 2390.0 | 0.037 |
| 2395.0 | 0.041 |
| 2400.0 | 0.044 |
| 2405.0 | 0.034 |
| 2410.0 | 0.034 |
| 2415.0 | 0.027 |
| 2420.0 | 0.027 |
| 2425.0 | 0.033 |
| 2430.0 | 0.045 |
| 2435.0 | 0.015 |
| 2440.0 | 0.043 |
| 2445.0 | 0.021 |
| 2450.0 | 0.014 |
| 2455.0 | 0.025 |
| 2460.0 | 0.033 |
| 2465.0 | 0.024 |
| 2470.0 | 0.017 |
| 2475.0 | 0.016 |
| 2480.0 | 0.008 |
| 2485.0 | 0.006 |
| 2490.0 | 0.004 |
| 2495.0 | 0.003 |
| 2500.0 | 0.007 |
| 2505.0 | 0.002 |
| 2510.0 | 0.002 |
| 2515.0 | 0.001 |
| 2520.0 | 0 |
| 2525.0 | 0 |
| 2530.0 | 0 |
| 2535.0 | 0 |
| 2540.0 | 0 |
| 2545.0 | 0 |
| 2550.0 | 0 |
| 2555.0 | 0 |
| 2560.0 | 0 |
| 2565.0 | 0 |
| 2570.0 | 0 |
| 2575.0 | 0 |
| 2580.0 | 0 |
| 2585.0 | 0 |
| 2590.0 | 0 |
| 2595.0 | 0 |
| 2600.0 | 0 |
| 2605.0 | 0 |
| 2610.0 | 0 |
| 2615.0 | 0 |
| 2620.0 | 0 |
| 2625.0 | 0 |
| 2630.0 | 0 |
| 2635.0 | 0 |
| 2640.0 | 0 |
| 2645.0 | 0 |
| 2650.0 | 0 |
| 2655.0 | 0 |
| 2660.0 | 0 |
| 2665.0 | 0 |
| 2670.0 | 0 |
| 2675.0 | 0 |
| 2680.0 | 0 |
| 2685.0 | 0 |
| 2690.0 | 0 |
| 2695.0 | 0 |
| 2700.0 | 0 |
| 2705.0 | 0 |
| 2710.0 | 0 |
| 2715.0 | 0 |
| 2720.0 | 0 |
| 2725.0 | 0 |
| 2730.0 | 0 |
| 2735.0 | 0 |
| 2740.0 | 0 |
| 2745.0 | 0 |
| 2750.0 | 0 |
| 2755.0 | 0 |
| 2760.0 | 0 |
| 2765.0 | 0 |
| 2770.0 | 0 |
| 2775.0 | 0 |
| 2780.0 | 0 |
| 2785.0 | 0 |
| 2790.0 | 0 |
| 2795.0 | 0 |
| 2800.0 | 0 |
| 2805.0 | 0 |
| 2810.0 | 0 |
| 2815.0 | 0 |
| 2820.0 | 0 |
| 2825.0 | 0 |
| 2830.0 | 0 |
| 2835.0 | 0 |
| 2840.0 | 0 |
| 2845.0 | 0 |
| 2850.0 | 0 |
| 2855.0 | 0 |
| 2860.0 | 0 |
| 2865.0 | 0 |
| 2870.0 | 0 |
| 2875.0 | 0 |
| 2880.0 | 0 |
| 2885.0 | 0 |
| 2890.0 | 0 |
| 2895.0 | 0.003 |
| 2900.0 | 0.001 |
| 2905.0 | 0 |
| 2910.0 | 0.003 |
| 2915.0 | 0.001 |
| 2920.0 | 0.003 |
| 2925.0 | 0.001 |
| 2930.0 | 0.006 |
| 2935.0 | 0.006 |
| 2940.0 | 0.002 |
| 2945.0 | 0.001 |
| 2950.0 | 0.005 |
| 2955.0 | 0.002 |
| 2960.0 | 0.005 |
| 2965.0 | 0.007 |
| 2970.0 | 0 |
| 2975.0 | 0.001 |
| 2980.0 | 0.001 |
| 2985.0 | 0.007 |
| 2990.0 | 0.01 |
| 2995.0 | 0.004 |
| 3000.0 | 0.008 |
| 3005.0 | 0.003 |
| 3010.0 | 0.007 |
| 3015.0 | 0.006 |
| 3020.0 | 0.001 |
| 3025.0 | 0.008 |
| 3030.0 | 0.006 |
| 3035.0 | 0.002 |
| 3040.0 | 0.002 |
| 3045.0 | 0.004 |
| 3050.0 | 0.001 |
| 3055.0 | 0 |
| 3060.0 | 0.006 |
| 3065.0 | 0.003 |
| 3070.0 | 0.002 |
| 3075.0 | 0.006 |
| 3080.0 | 0.004 |
| 3085.0 | 0.002 |
| 3090.0 | 0.002 |
| 3095.0 | 0.001 |
| 3100.0 | 0.004 |
| 3105.0 | 0.001 |
| 3110.0 | 0.001 |
| 3115.0 | 0.002 |
| 3120.0 | 0.01 |
| 3125.0 | 0.003 |
| 3130.0 | 0.006 |
| 3135.0 | 0.011 |
| 3140.0 | 0.003 |
| 3145.0 | 0.003 |
| 3150.0 | 0.007 |
| 3155.0 | 0.006 |
| 3160.0 | 0.009 |
| 3165.0 | 0.014 |
| 3170.0 | 0.013 |
| 3175.0 | 0.009 |
| 3180.0 | 0.011 |
| 3185.0 | 0.008 |
| 3190.0 | 0.004 |
| 3195.0 | 0.003 |
| 3200.0 | 0 |
| 3205.0 | 0 |
| 3210.0 | 0 |
| 3215.0 | 0 |
| 3220.0 | 0.002 |
| 3225.0 | 0 |
| 3230.0 | 0 |
| 3235.0 | 0.007 |
| 3240.0 | 0.004 |
| 3245.0 | 0.001 |
| 3250.0 | 0.003 |
| 3255.0 | 0.01 |
| 3260.0 | 0.001 |
| 3265.0 | 0.002 |
| 3270.0 | 0.001 |
| 3275.0 | 0.006 |
| 3280.0 | 0.003 |
| 3285.0 | 0.011 |
| 3290.0 | 0.009 |
| 3295.0 | 0.001 |
| 3300.0 | 0.002 |
| 3305.0 | 0.004 |
| 3310.0 | 0.004 |
| 3315.0 | 0 |
| 3320.0 | 0 |
| 3325.0 | 0.004 |
| 3330.0 | 0.005 |
| 3335.0 | 0.009 |
| 3340.0 | 0.003 |
| 3345.0 | 0.004 |
| 3350.0 | 0.008 |
| 3355.0 | 0.004 |
| 3360.0 | 0.005 |
| 3365.0 | 0.007 |
| 3370.0 | 0.004 |
| 3375.0 | 0.008 |
| 3380.0 | 0.005 |
| 3385.0 | 0.007 |
| 3390.0 | 0.01 |
| 3395.0 | 0.01 |
| 3400.0 | 0.013 |
| 3405.0 | 0.004 |
| 3410.0 | 0.007 |
| 3415.0 | 0.007 |
| 3420.0 | 0.013 |
| 3425.0 | 0.01 |
| 3430.0 | 0.009 |
| 3435.0 | 0.012 |
| 3440.0 | 0.008 |
| 3445.0 | 0.011 |
| 3450.0 | 0.011 |
| 3455.0 | 0.008 |
| 3460.0 | 0.013 |
| 3465.0 | 0.01 |
| 3470.0 | 0.012 |
| 3475.0 | 0.011 |
| 3480.0 | 0.011 |
| 3485.0 | 0.012 |
| 3490.0 | 0.01 |
| 3495.0 | 0.012 |
| 3500.0 | 0.012 |
| 3505.0 | 0.012 |
| 3510.0 | 0.012 |
| 3515.0 | 0.011 |
| 3520.0 | 0.012 |
| 3525.0 | 0.011 |
| 3530.0 | 0.011 |
| 3535.0 | 0.009 |
| 3540.0 | 0.009 |
| 3545.0 | 0.01 |
| 3550.0 | 0.011 |
| 3555.0 | 0.009 |
| 3560.0 | 0.011 |
| 3565.0 | 0.011 |
| 3570.0 | 0.008 |
| 3575.0 | 0.009 |
| 3580.0 | 0.01 |
| 3585.0 | 0.009 |
| 3590.0 | 0.009 |
| 3595.0 | 0.01 |
| 3600.0 | 0.01 |
| 3605.0 | 0.01 |
| 3610.0 | 0.009 |
| 3615.0 | 0.009 |
| 3620.0 | 0.012 |
| 3625.0 | 0.01 |
| 3630.0 | 0.01 |
| 3635.0 | 0.01 |
| 3640.0 | 0.011 |
| 3645.0 | 0.011 |
| 3650.0 | 0.01 |
| 3655.0 | 0.011 |
| 3660.0 | 0.011 |
| 3665.0 | 0.01 |
| 3670.0 | 0.008 |
| 3675.0 | 0.005 |
| 3680.0 | 0.008 |
| 3685.0 | 0.009 |
| 3690.0 | 0.01 |
| 3695.0 | 0.01 |
| 3700.0 | 0.011 |
| 3705.0 | 0.011 |
| 3710.0 | 0.009 |
| 3715.0 | 0.009 |
| 3720.0 | 0.01 |
| 3725.0 | 0.011 |
| 3730.0 | 0.009 |
| 3735.0 | 0.009 |
| 3740.0 | 0.009 |
| 3745.0 | 0.01 |
| 3750.0 | 0.009 |
| 3755.0 | 0.009 |
| 3760.0 | 0.009 |
| 3765.0 | 0.009 |
| 3770.0 | 0.009 |
| 3775.0 | 0.009 |
| 3780.0 | 0.01 |
| 3785.0 | 0.009 |
| 3790.0 | 0.008 |
| 3795.0 | 0.009 |
| 3800.0 | 0.01 |
| 3805.0 | 0.009 |
| 3810.0 | 0.008 |
| 3815.0 | 0.008 |
| 3820.0 | 0.01 |
| 3825.0 | 0.01 |
| 3830.0 | 0.01 |
| 3835.0 | 0.008 |
| 3840.0 | 0.009 |
| 3845.0 | 0.009 |
| 3850.0 | 0.009 |
| 3855.0 | 0.009 |
| 3860.0 | 0.008 |
| 3865.0 | 0.008 |
| 3870.0 | 0.007 |
| 3875.0 | 0.007 |
| 3880.0 | 0.007 |
| 3885.0 | 0.007 |
| 3890.0 | 0.007 |
| 3895.0 | 0.007 |
| 3900.0 | 0.008 |
| 3905.0 | 0.008 |
| 3910.0 | 0.007 |
| 3915.0 | 0.007 |
| 3920.0 | 0.007 |
| 3925.0 | 0.007 |
| 3930.0 | 0.007 |
| 3935.0 | 0.007 |
| 3940.0 | 0.007 |
| 3945.0 | 0.008 |
| 3950.0 | 0.008 |
| 3955.0 | 0.008 |
| 3960.0 | 0.008 |
| 3965.0 | 0.008 |
| 3970.0 | 0.008 |
| 3975.0 | 0.008 |
| 3980.0 | 0.007 |
| 3985.0 | 0.007 |
| 3990.0 | 0.007 |
| 3995.0 | 0.007 |
| 4000.0 | 0.007 |